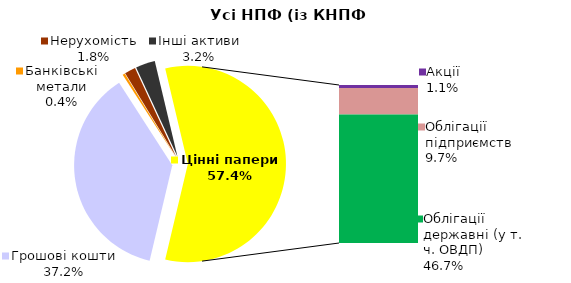
| Category | Усі НПФ (із КНПФ НБУ)* |
|---|---|
| Грошові кошти | 923.9 |
| Банківські метали | 9.7 |
| Нерухомість | 45.1 |
| Інші активи | 79.5 |
| Акції | 26.3 |
| Облігації підприємств | 240.3 |
| Муніципальні облігації | 0 |
| Облігації державні (у т. ч. ОВДП) | 1160.4 |